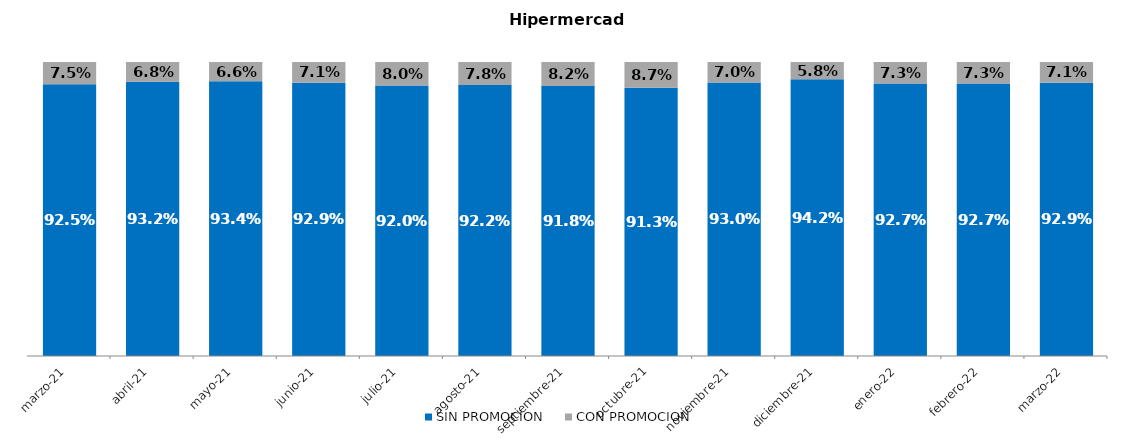
| Category | SIN PROMOCION   | CON PROMOCION   |
|---|---|---|
| 2021-03-01 | 0.925 | 0.075 |
| 2021-04-01 | 0.932 | 0.068 |
| 2021-05-01 | 0.934 | 0.066 |
| 2021-06-01 | 0.929 | 0.071 |
| 2021-07-01 | 0.92 | 0.08 |
| 2021-08-01 | 0.922 | 0.078 |
| 2021-09-01 | 0.918 | 0.082 |
| 2021-10-01 | 0.913 | 0.087 |
| 2021-11-01 | 0.93 | 0.07 |
| 2021-12-01 | 0.942 | 0.058 |
| 2022-01-01 | 0.927 | 0.073 |
| 2022-02-01 | 0.927 | 0.073 |
| 2022-03-01 | 0.929 | 0.071 |